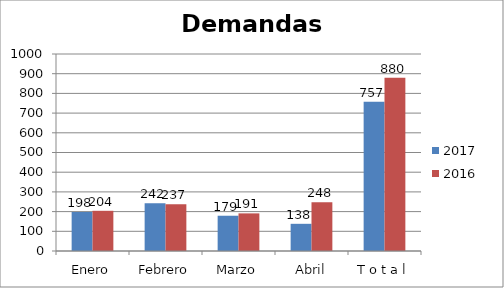
| Category | 2017 | 2016 |
|---|---|---|
| Enero | 198 | 204 |
| Febrero | 242 | 237 |
| Marzo | 179 | 191 |
| Abril | 138 | 248 |
| T o t a l | 757 | 880 |